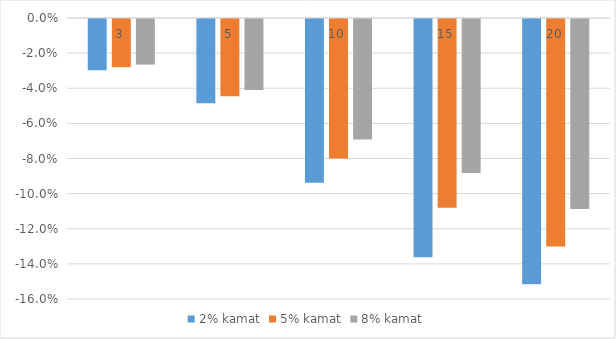
| Category | 2% kamat | 5% kamat | 8% kamat |
|---|---|---|---|
| 3.0 | -0.029 | -0.027 | -0.026 |
| 5.0 | -0.048 | -0.044 | -0.04 |
| 10.0 | -0.093 | -0.079 | -0.069 |
| 15.0 | -0.136 | -0.108 | -0.088 |
| 20.0 | -0.151 | -0.13 | -0.108 |